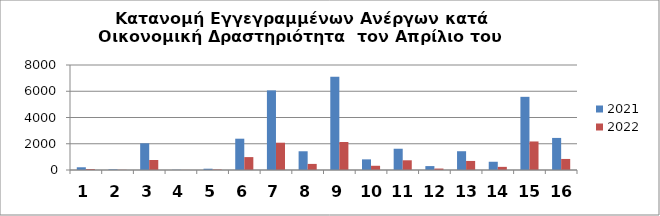
| Category | 2021 | 2022 |
|---|---|---|
| 0 | 208 | 70 |
| 1 | 47 | 13 |
| 2 | 2034 | 761 |
| 3 | 16 | 6 |
| 4 | 98 | 36 |
| 5 | 2385 | 983 |
| 6 | 6066 | 2079 |
| 7 | 1427 | 464 |
| 8 | 7100 | 2135 |
| 9 | 810 | 322 |
| 10 | 1620 | 740 |
| 11 | 298 | 110 |
| 12 | 1430 | 690 |
| 13 | 628 | 239 |
| 14 | 5575 | 2174 |
| 15 | 2444 | 842 |